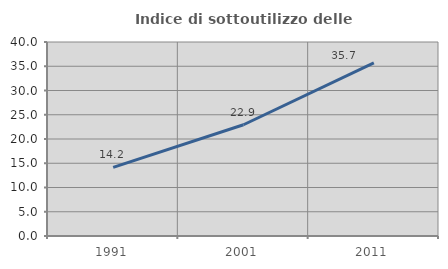
| Category | Indice di sottoutilizzo delle abitazioni  |
|---|---|
| 1991.0 | 14.159 |
| 2001.0 | 22.936 |
| 2011.0 | 35.714 |